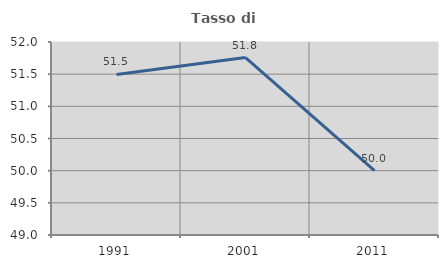
| Category | Tasso di occupazione   |
|---|---|
| 1991.0 | 51.495 |
| 2001.0 | 51.758 |
| 2011.0 | 50 |